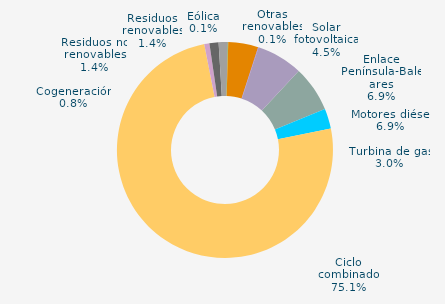
| Category | Series 0 |
|---|---|
| Carbón | 0 |
| Motores diésel | 6.861 |
| Turbina de gas | 3.021 |
| Ciclo combinado | 75.089 |
| Generación auxiliar | 0 |
| Cogeneración | 0.772 |
| Residuos no renovables | 1.368 |
| Residuos renovables | 1.368 |
| Eólica | 0.057 |
| Solar fotovoltaica | 4.476 |
| Otras renovables | 0.071 |
| Enlace Península-Baleares | 6.916 |